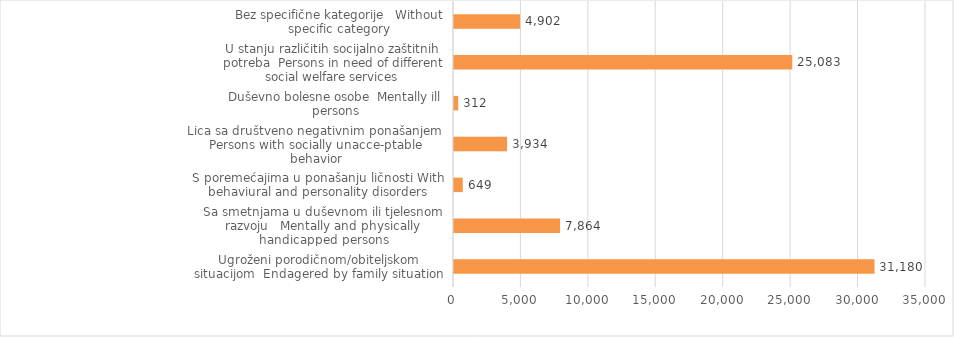
| Category | Series 5 |
|---|---|
| Ugroženi porodičnom/obiteljskom situacijom  Endagered by family situation | 31180 |
| Sa smetnjama u duševnom ili tjelesnom razvoju   Mentally and physically handicapped persons | 7864 |
| S poremećajima u ponašanju ličnosti With behaviural and personality disorders | 649 |
| Lica sa društveno negativnim ponašanjem  Persons with socially unacce-ptable behavior | 3934 |
| Duševno bolesne osobe  Mentally ill persons | 312 |
| U stanju različitih socijalno zaštitnih potreba  Persons in need of different social welfare services | 25083 |
| Bez specifične kategorije   Without specific category | 4902 |